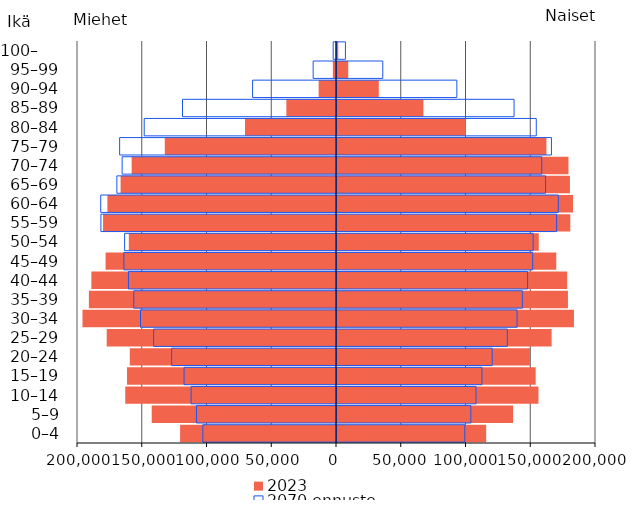
| Category | 2023 | 2070 ennuste |
|---|---|---|
| 0–4 | 115211 | 98675 |
| 5–9 | 136012 | 103340 |
| 10–14 | 155573 | 107315 |
| 15–19 | 153424 | 111910 |
| 20–24 | 148987 | 119832 |
| 25–29 | 165738 | 131518 |
| 30–34 | 182972 | 139035 |
| 35–39 | 178335 | 143112 |
| 40–44 | 177751 | 147183 |
| 45–49 | 169327 | 151106 |
| 50–54 | 155810 | 151443 |
| 55–59 | 180155 | 169578 |
| 60–64 | 182260 | 170887 |
| 65–69 | 179869 | 161040 |
| 70–74 | 178732 | 158084 |
| 75–79 | 161722 | 165589 |
| 80–84 | 99450 | 153874 |
| 85–89 | 66715 | 136731 |
| 90–94 | 32267 | 92552 |
| 95–99 | 8664 | 35341 |
| 100–     | 979 | 6515 |